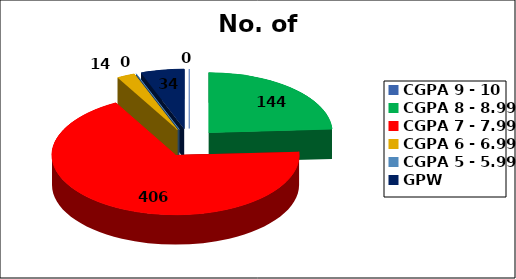
| Category | No. of Students |
|---|---|
| CGPA 9 - 10 | 0 |
| CGPA 8 - 8.99 | 144 |
| CGPA 7 - 7.99 | 406 |
| CGPA 6 - 6.99 | 14 |
| CGPA 5 - 5.99 | 0 |
| GPW | 34 |